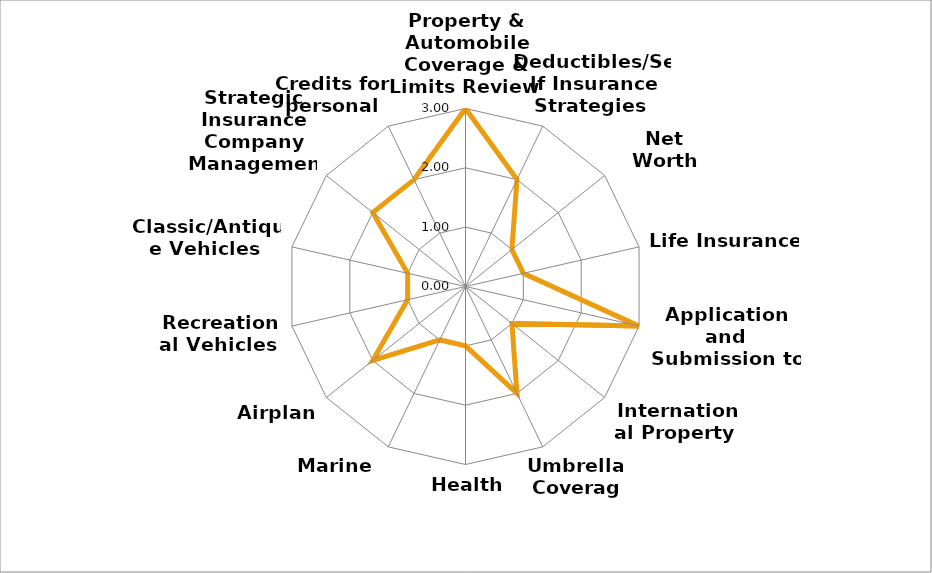
| Category | Series 0 |
|---|---|
| Property & Automobile Coverage & Limits Review  | 3 |
| Deductibles/Self Insurance Strategies  | 2 |
| Net Worth Protection | 1 |
| Life Insurance   | 1 |
| Application and Submission to Carriers | 3 |
| International Property  | 1 |
| Umbrella Coverage | 2 |
| Health Insurance  | 1 |
| Marine Insurance  | 1 |
| Airplane | 2 |
| Recreational Vehicles  | 1 |
| Classic/Antique Vehicles  | 1 |
| Strategic Insurance Company Management | 2 |
| Credits for personal coverage | 2 |